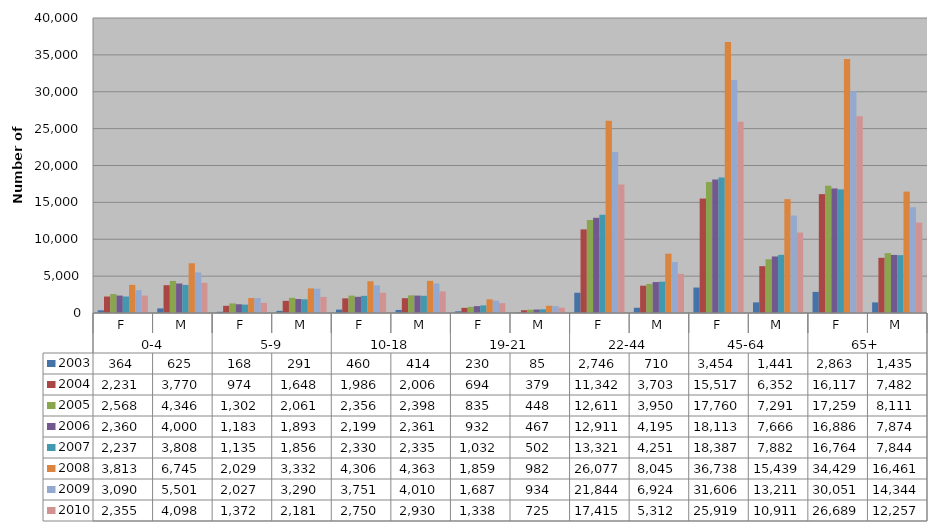
| Category | 2003 | 2004 | 2005 | 2006 | 2007 | 2008 | 2009 | 2010 |
|---|---|---|---|---|---|---|---|---|
| 0 | 364 | 2231 | 2568 | 2360 | 2237 | 3813 | 3090 | 2355 |
| 1 | 625 | 3770 | 4346 | 4000 | 3808 | 6745 | 5501 | 4098 |
| 2 | 168 | 974 | 1302 | 1183 | 1135 | 2029 | 2027 | 1372 |
| 3 | 291 | 1648 | 2061 | 1893 | 1856 | 3332 | 3290 | 2181 |
| 4 | 460 | 1986 | 2356 | 2199 | 2330 | 4306 | 3751 | 2750 |
| 5 | 414 | 2006 | 2398 | 2361 | 2335 | 4363 | 4010 | 2930 |
| 6 | 230 | 694 | 835 | 932 | 1032 | 1859 | 1687 | 1338 |
| 7 | 85 | 379 | 448 | 467 | 502 | 982 | 934 | 725 |
| 8 | 2746 | 11342 | 12611 | 12911 | 13321 | 26077 | 21844 | 17415 |
| 9 | 710 | 3703 | 3950 | 4195 | 4251 | 8045 | 6924 | 5312 |
| 10 | 3454 | 15517 | 17760 | 18113 | 18387 | 36738 | 31606 | 25919 |
| 11 | 1441 | 6352 | 7291 | 7666 | 7882 | 15439 | 13211 | 10911 |
| 12 | 2863 | 16117 | 17259 | 16886 | 16764 | 34429 | 30051 | 26689 |
| 13 | 1435 | 7482 | 8111 | 7874 | 7844 | 16461 | 14344 | 12257 |